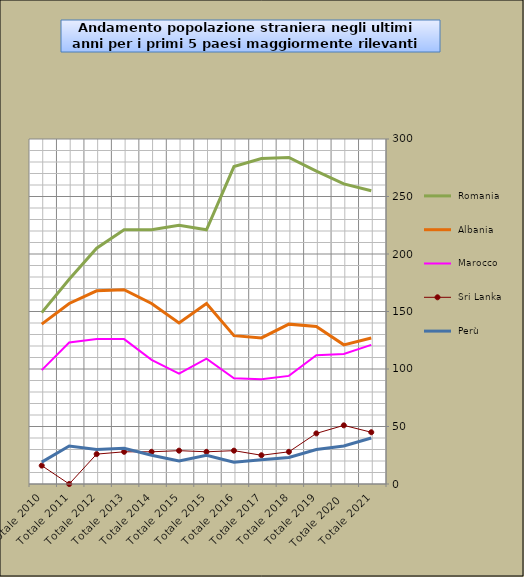
| Category |  Romania  |  Albania  |  Marocco  |  Sri Lanka  |  Perù  |
|---|---|---|---|---|---|
| Totale 2021 | 255 | 127 | 121 | 45 | 40 |
| Totale 2020  | 261 | 121 | 113 | 51 | 33 |
| Totale 2019 | 272 | 137 | 112 | 44 | 30 |
| Totale 2018 | 284 | 139 | 94 | 28 | 23 |
| Totale 2017 | 283 | 127 | 91 | 25 | 21 |
| Totale 2016 | 276 | 129 | 92 | 29 | 19 |
| Totale 2015 | 221 | 157 | 109 | 28 | 25 |
| Totale 2015 | 225 | 140 | 96 | 29 | 20 |
| Totale 2014 | 221 | 157 | 108 | 28 | 25 |
| Totale 2013 | 221 | 169 | 126 | 28 | 31 |
| Totale 2012 | 205 | 168 | 126 | 26 | 30 |
| Totale 2011 | 178 | 157 | 123 | 0 | 33 |
| Totale 2010 | 149 | 139 | 99 | 16 | 19 |